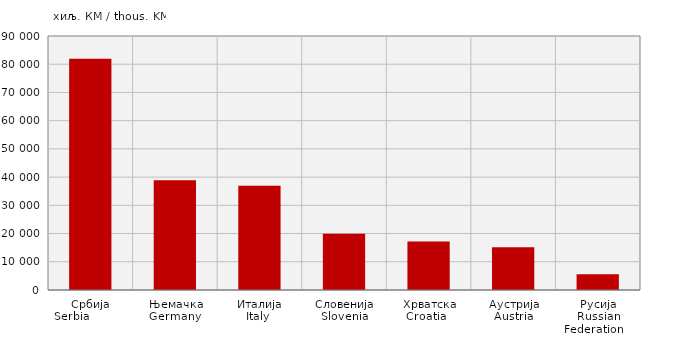
| Category | Увоз
Import |
|---|---|
| Србија
Serbia            | 81925 |
| Њемачка
Germany  | 38890 |
| Италија
Italy  | 36913 |
| Словенија
Slovenia | 19963 |
| Хрватска
Croatia   | 17208 |
| Аустрија
Austria | 15148 |
| Русија
Russian Federation    | 5612 |